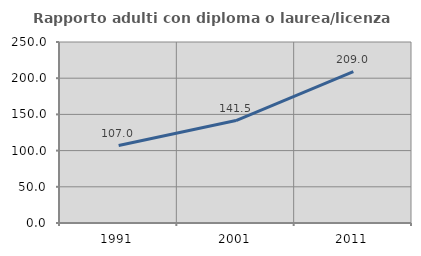
| Category | Rapporto adulti con diploma o laurea/licenza media  |
|---|---|
| 1991.0 | 107.039 |
| 2001.0 | 141.537 |
| 2011.0 | 209.033 |